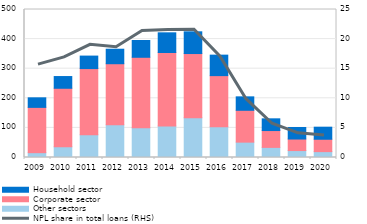
| Category | Other sectors | Corporate sector | Household sector |
|---|---|---|---|
| 2009.0 | 16.3 | 153.043 | 32.3 |
| 2010.0 | 36.3 | 197.6 | 39.6 |
| 2011.0 | 77.1 | 223.3 | 42.2 |
| 2012.0 | 110.5 | 206.3 | 49 |
| 2013.0 | 100.2 | 238.4 | 56.7 |
| 2014.0 | 106.4 | 248.4 | 66.4 |
| 2015.0 | 134.4 | 216.8 | 73.4 |
| 2016.0 | 103.8 | 172.8 | 69.2 |
| 2017.0 | 51.9 | 107.6 | 45.4 |
| 2018.0 | 34.192 | 56.849 | 39.608 |
| 2019.0 | 23.45 | 38.949 | 39.017 |
| 2020.0 | 19.835 | 41.827 | 40.747 |